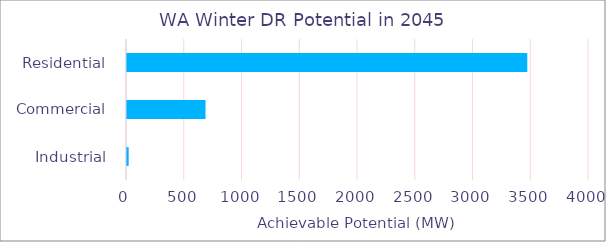
| Category | Series 0 |
|---|---|
|  Residential  | 3474.287 |
|  Commercial  | 688.54 |
|  Industrial  | 23.186 |